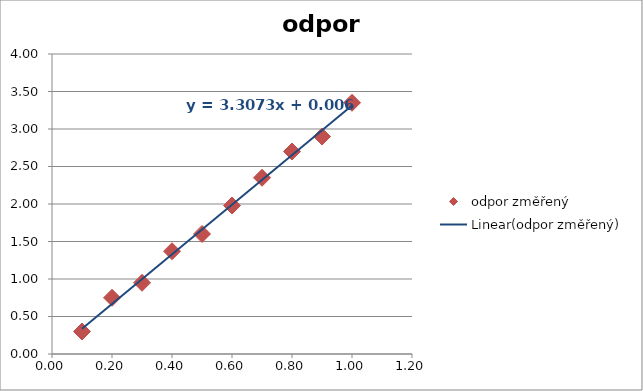
| Category | odpor změřený |
|---|---|
| 0.1 | 0.3 |
| 0.2 | 0.75 |
| 0.3 | 0.95 |
| 0.4 | 1.37 |
| 0.5 | 1.6 |
| 0.6 | 1.98 |
| 0.7 | 2.35 |
| 0.8 | 2.7 |
| 0.9 | 2.9 |
| 1.0 | 3.35 |